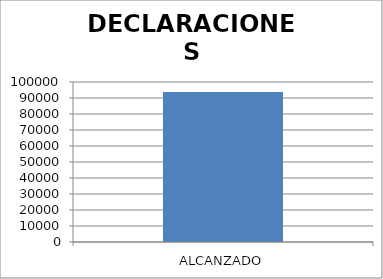
| Category | DECLARACIONES PATRIMONIALES |
|---|---|
| ALCANZADO | 93727 |